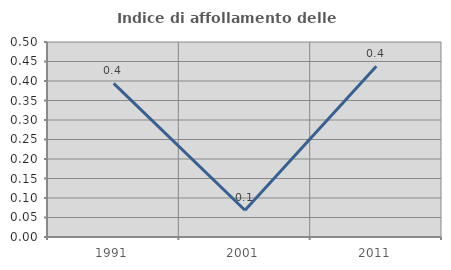
| Category | Indice di affollamento delle abitazioni  |
|---|---|
| 1991.0 | 0.394 |
| 2001.0 | 0.069 |
| 2011.0 | 0.438 |